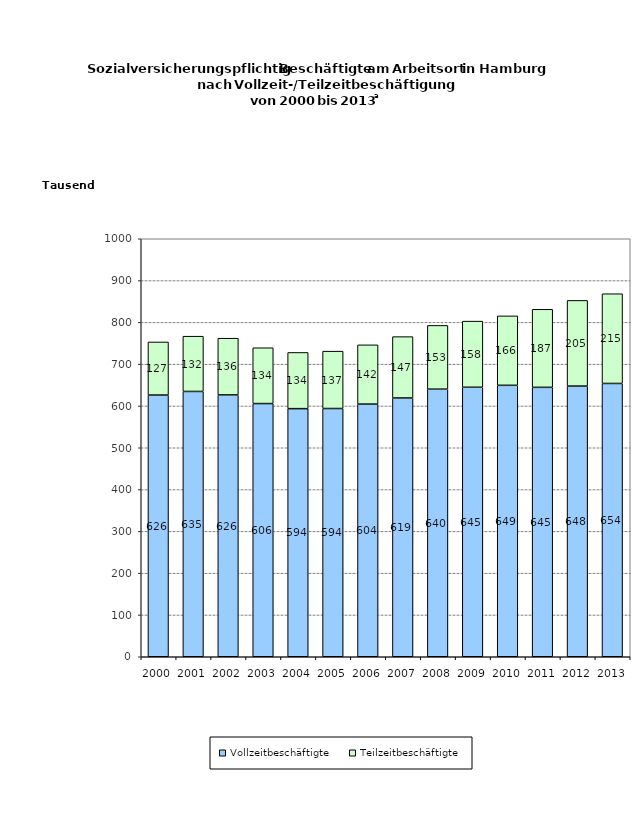
| Category | Vollzeitbeschäftigte | Teilzeitbeschäftigte |
|---|---|---|
| 2000.0 | 626047 | 127091 |
| 2001.0 | 634688 | 132231 |
| 2002.0 | 626402 | 135678 |
| 2003.0 | 605715 | 133522 |
| 2004.0 | 593547 | 134454 |
| 2005.0 | 593868 | 137253 |
| 2006.0 | 604458 | 141740 |
| 2007.0 | 619086 | 146785 |
| 2008.0 | 640202 | 152519 |
| 2009.0 | 644703 | 158253 |
| 2010.0 | 649378 | 166112 |
| 2011.0 | 644546 | 186707 |
| 2012.0 | 647561 | 204920 |
| 2013.0 | 653802 | 214677 |